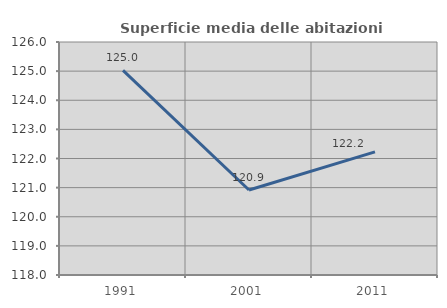
| Category | Superficie media delle abitazioni occupate |
|---|---|
| 1991.0 | 125.026 |
| 2001.0 | 120.918 |
| 2011.0 | 122.226 |